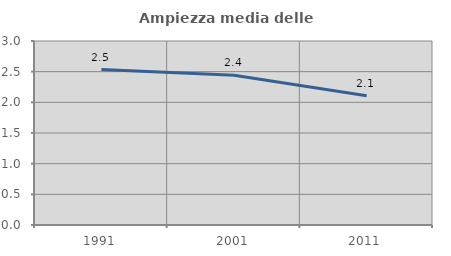
| Category | Ampiezza media delle famiglie |
|---|---|
| 1991.0 | 2.535 |
| 2001.0 | 2.442 |
| 2011.0 | 2.106 |